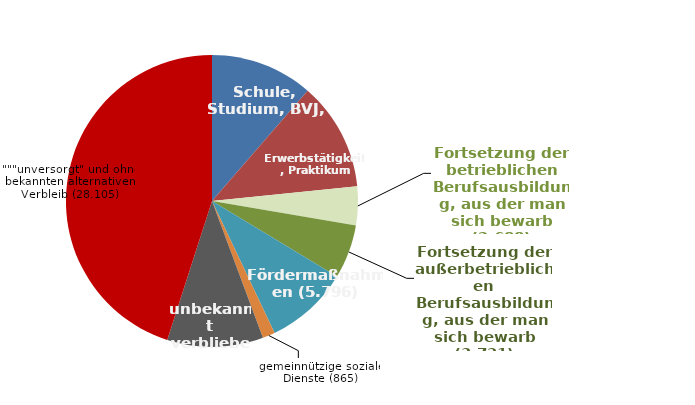
| Category | Verbleib der Bewerber die nicht in eine Berufsausbildung einmündeten |
|---|---|
| Schule, Studium, BVJ, BGJ | 7092 |
| Erwerbstätigkeit, Praktikum | 7501 |
| Fortsetzung der betrieblichen Berufsausbildung, aus der man sich bewarb | 2688 |
| Fortsetzung der außerbetrieblichen Berufsausbildung, aus der man sich bewarb | 3721 |
| Fördermaßnahmen | 5796 |
| gemeinnützige soziale Dienste | 865 |
| unbekannt verblieben | 6633 |
| unversorgt und ohne alternativen Verbleib | 28105 |